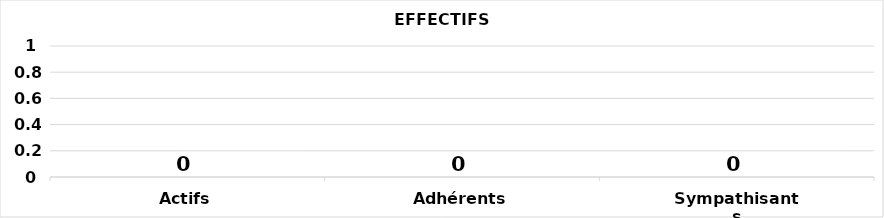
| Category | Series 0 |
|---|---|
| Actifs | 0 |
| Adhérents | 0 |
| Sympathisants | 0 |